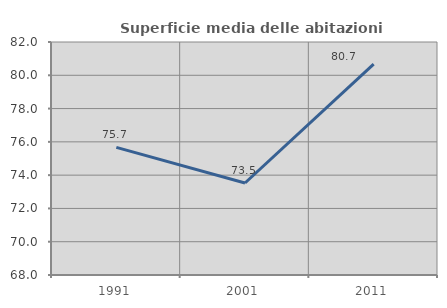
| Category | Superficie media delle abitazioni occupate |
|---|---|
| 1991.0 | 75.668 |
| 2001.0 | 73.528 |
| 2011.0 | 80.665 |